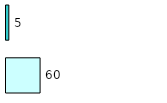
| Category | Series 0 | Series 1 |
|---|---|---|
| 0 | 60 | 5 |